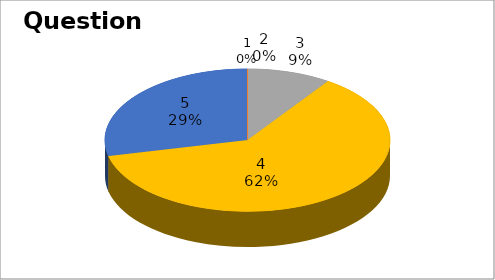
| Category | Series 0 |
|---|---|
| 0 | 0 |
| 1 | 0 |
| 2 | 2 |
| 3 | 13 |
| 4 | 6 |